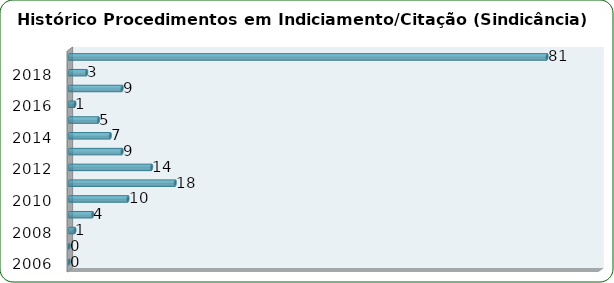
| Category | Total de Sindicâncias  |
|---|---|
| 2006 | 0 |
| 2007 | 0 |
| 2008 | 1 |
| 2009 | 4 |
| 2010 | 10 |
| 2011 | 18 |
| 2012 | 14 |
| 2013 | 9 |
| 2014 | 7 |
| 2015 | 5 |
| 2016 | 1 |
| 2017 | 9 |
| 2018 | 3 |
| Total | 81 |